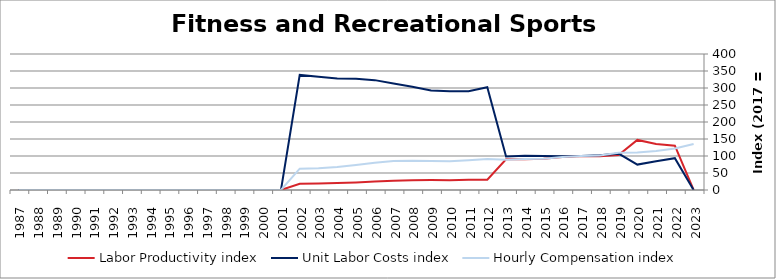
| Category | Labor Productivity index | Unit Labor Costs index | Hourly Compensation index |
|---|---|---|---|
| 2023.0 | 0 | 0 | 135.155 |
| 2022.0 | 130.261 | 93.5 | 121.795 |
| 2021.0 | 135.555 | 84.86 | 115.033 |
| 2020.0 | 147.234 | 74.708 | 109.995 |
| 2019.0 | 102.608 | 106.921 | 109.71 |
| 2018.0 | 99.162 | 102.336 | 101.479 |
| 2017.0 | 100 | 100 | 100 |
| 2016.0 | 97.133 | 99.618 | 96.762 |
| 2015.0 | 91.753 | 99.821 | 91.589 |
| 2014.0 | 90.216 | 100.839 | 90.973 |
| 2013.0 | 90.584 | 98.594 | 89.31 |
| 2012.0 | 30.241 | 302.461 | 91.467 |
| 2011.0 | 30.224 | 290.388 | 87.767 |
| 2010.0 | 29.011 | 290.491 | 84.274 |
| 2009.0 | 29.16 | 292.385 | 85.259 |
| 2008.0 | 28.326 | 303.942 | 86.094 |
| 2007.0 | 27.223 | 313.084 | 85.231 |
| 2006.0 | 24.822 | 323.153 | 80.212 |
| 2005.0 | 22.408 | 327.029 | 73.282 |
| 2004.0 | 20.582 | 328.278 | 67.566 |
| 2003.0 | 19.247 | 333.427 | 64.173 |
| 2002.0 | 18.505 | 338.523 | 62.642 |
| 2001.0 | 0 | 0 | 0 |
| 2000.0 | 0 | 0 | 0 |
| 1999.0 | 0 | 0 | 0 |
| 1998.0 | 0 | 0 | 0 |
| 1997.0 | 0 | 0 | 0 |
| 1996.0 | 0 | 0 | 0 |
| 1995.0 | 0 | 0 | 0 |
| 1994.0 | 0 | 0 | 0 |
| 1993.0 | 0 | 0 | 0 |
| 1992.0 | 0 | 0 | 0 |
| 1991.0 | 0 | 0 | 0 |
| 1990.0 | 0 | 0 | 0 |
| 1989.0 | 0 | 0 | 0 |
| 1988.0 | 0 | 0 | 0 |
| 1987.0 | 0 | 0 | 0 |